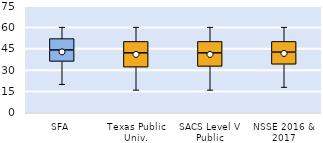
| Category | 25th | 50th | 75th |
|---|---|---|---|
| SFA | 36 | 8 | 8 |
| Texas Public Univ. | 32 | 10 | 8 |
| SACS Level V Public | 32.5 | 9.5 | 8 |
| NSSE 2016 & 2017 | 34 | 8.5 | 7.5 |